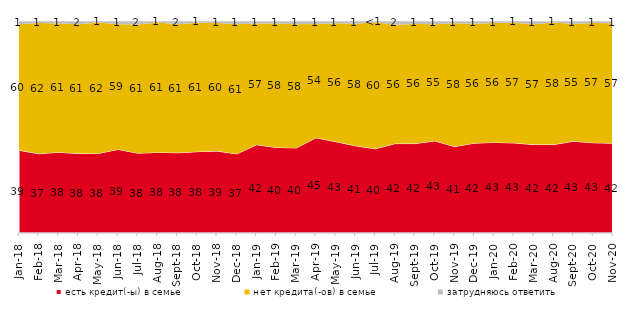
| Category | есть кредит(-ы) в семье | нет кредита(-ов) в семье | затрудняюсь ответить |
|---|---|---|---|
| 2018-01-01 | 39.05 | 59.5 | 1.45 |
| 2018-02-01 | 37.4 | 61.8 | 0.8 |
| 2018-03-01 | 38.15 | 60.8 | 1.05 |
| 2018-04-01 | 37.5 | 61 | 1.5 |
| 2018-05-01 | 37.55 | 61.8 | 0.65 |
| 2018-06-01 | 39.45 | 59.15 | 1.35 |
| 2018-07-01 | 37.7 | 60.7 | 1.6 |
| 2018-08-01 | 38.05 | 61.3 | 0.65 |
| 2018-09-01 | 37.9 | 60.6 | 1.5 |
| 2018-10-01 | 38.4 | 60.85 | 0.75 |
| 2018-11-01 | 38.673 | 60.479 | 0.848 |
| 2018-12-01 | 37.35 | 61.2 | 1.45 |
| 2019-01-01 | 41.65 | 57.3 | 1.05 |
| 2019-02-01 | 40.4 | 58.45 | 1.15 |
| 2019-03-01 | 40.179 | 58.379 | 1.442 |
| 2019-04-01 | 44.95 | 53.762 | 1.287 |
| 2019-05-01 | 43.091 | 55.968 | 0.941 |
| 2019-06-01 | 41.147 | 57.656 | 1.197 |
| 2019-07-01 | 39.752 | 59.752 | 0.495 |
| 2019-08-01 | 42.208 | 56.144 | 1.648 |
| 2019-09-01 | 42.228 | 56.485 | 1.287 |
| 2019-10-01 | 43.465 | 55.099 | 1.436 |
| 2019-11-01 | 40.792 | 58.218 | 0.99 |
| 2019-12-01 | 42.426 | 56.386 | 1.188 |
| 2020-01-01 | 42.772 | 56.337 | 0.891 |
| 2020-02-01 | 42.525 | 56.782 | 0.693 |
| 2020-03-01 | 41.745 | 56.817 | 1.438 |
| 2020-08-01 | 41.758 | 57.597 | 0.645 |
| 2020-09-01 | 43.305 | 55.351 | 1.344 |
| 2020-10-01 | 42.601 | 56.502 | 0.897 |
| 2020-11-01 | 42.4 | 56.65 | 0.95 |